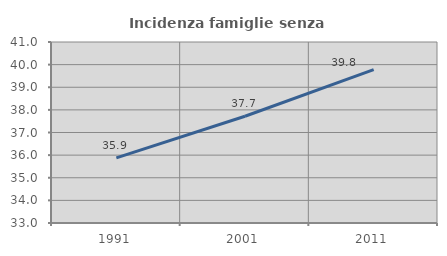
| Category | Incidenza famiglie senza nuclei |
|---|---|
| 1991.0 | 35.881 |
| 2001.0 | 37.717 |
| 2011.0 | 39.779 |